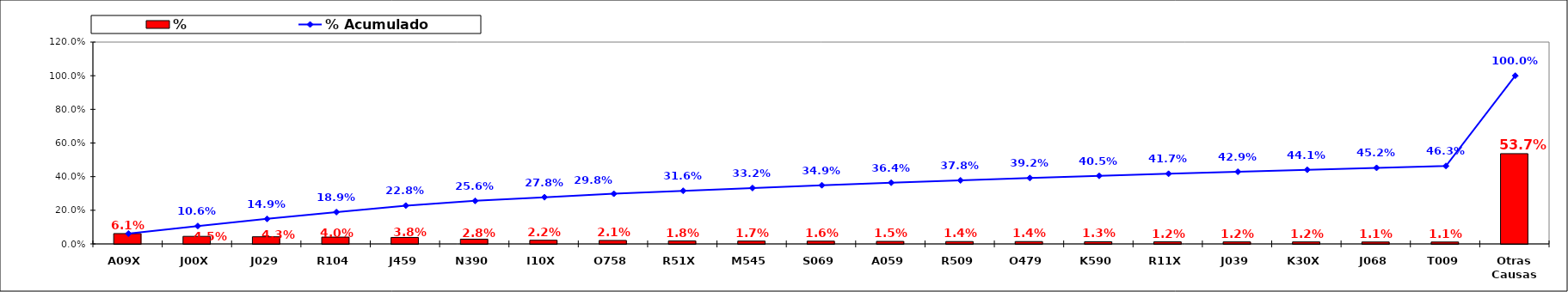
| Category | % |
|---|---|
| A09X | 0.061 |
| J00X | 0.045 |
| J029 | 0.043 |
| R104 | 0.04 |
| J459 | 0.038 |
| N390 | 0.028 |
| I10X | 0.022 |
| O758 | 0.021 |
| R51X | 0.018 |
| M545 | 0.017 |
| S069 | 0.016 |
| A059 | 0.015 |
| R509 | 0.014 |
| O479 | 0.014 |
| K590 | 0.013 |
| R11X | 0.012 |
| J039 | 0.012 |
| K30X | 0.012 |
| J068 | 0.011 |
| T009 | 0.011 |
| Otras Causas | 0.537 |